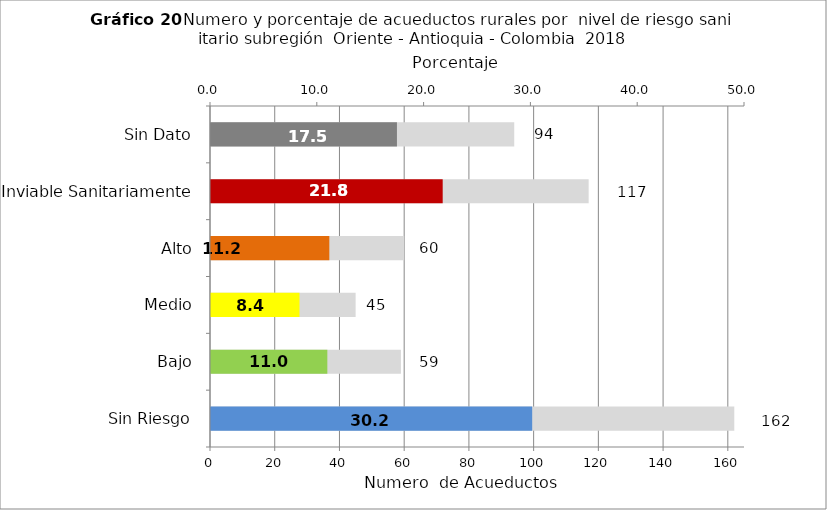
| Category | Número de Sistemas |
|---|---|
| Sin Riesgo | 162 |
| Bajo | 59 |
| Medio | 45 |
| Alto | 60 |
| Inviable Sanitariamente | 117 |
| Sin Dato | 94 |